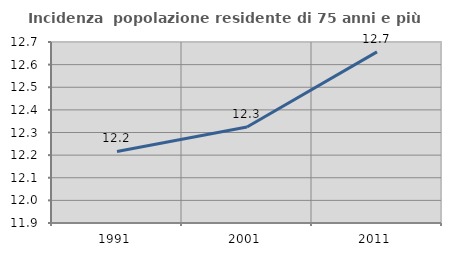
| Category | Incidenza  popolazione residente di 75 anni e più |
|---|---|
| 1991.0 | 12.216 |
| 2001.0 | 12.324 |
| 2011.0 | 12.656 |